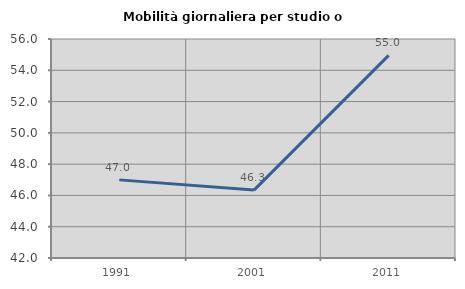
| Category | Mobilità giornaliera per studio o lavoro |
|---|---|
| 1991.0 | 46.994 |
| 2001.0 | 46.343 |
| 2011.0 | 54.951 |